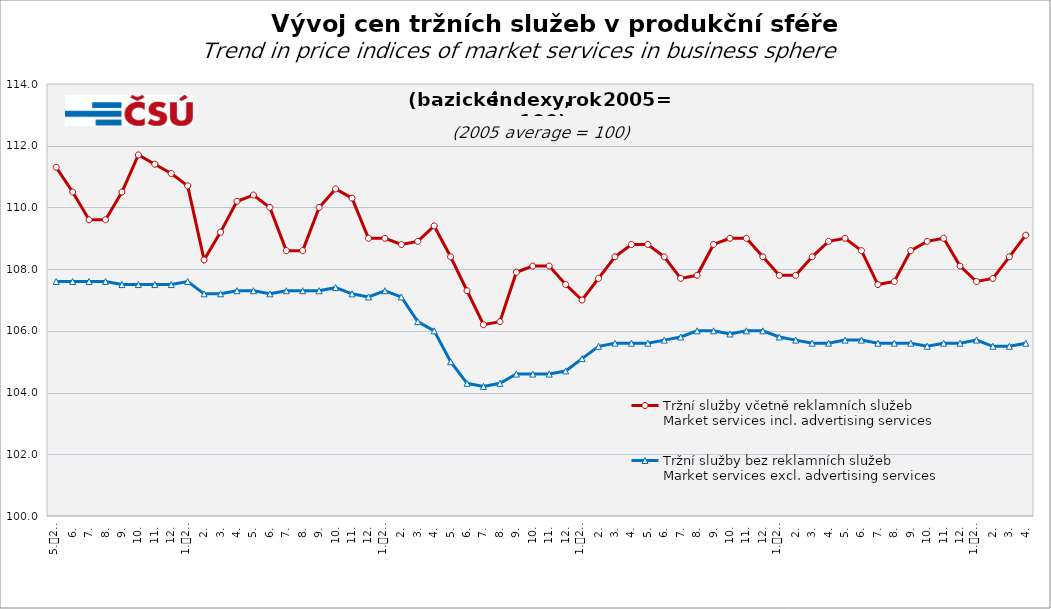
| Category | Tržní služby včetně reklamních služeb
Market services incl. advertising services | Tržní služby bez reklamních služeb
Market services excl. advertising services |
|---|---|---|
| 0 | 111.3 | 107.6 |
| 1 | 110.5 | 107.6 |
| 2 | 109.6 | 107.6 |
| 3 | 109.6 | 107.6 |
| 4 | 110.5 | 107.5 |
| 5 | 111.7 | 107.5 |
| 6 | 111.4 | 107.5 |
| 7 | 111.1 | 107.5 |
| 8 | 110.7 | 107.6 |
| 9 | 108.3 | 107.2 |
| 10 | 109.2 | 107.2 |
| 11 | 110.2 | 107.3 |
| 12 | 110.4 | 107.3 |
| 13 | 110 | 107.2 |
| 14 | 108.6 | 107.3 |
| 15 | 108.6 | 107.3 |
| 16 | 110 | 107.3 |
| 17 | 110.6 | 107.4 |
| 18 | 110.3 | 107.2 |
| 19 | 109 | 107.1 |
| 20 | 109 | 107.3 |
| 21 | 108.8 | 107.1 |
| 22 | 108.9 | 106.3 |
| 23 | 109.4 | 106 |
| 24 | 108.4 | 105 |
| 25 | 107.3 | 104.3 |
| 26 | 106.2 | 104.2 |
| 27 | 106.3 | 104.3 |
| 28 | 107.9 | 104.6 |
| 29 | 108.1 | 104.6 |
| 30 | 108.1 | 104.6 |
| 31 | 107.5 | 104.7 |
| 32 | 107 | 105.1 |
| 33 | 107.7 | 105.5 |
| 34 | 108.4 | 105.6 |
| 35 | 108.8 | 105.6 |
| 36 | 108.8 | 105.6 |
| 37 | 108.4 | 105.7 |
| 38 | 107.7 | 105.8 |
| 39 | 107.8 | 106 |
| 40 | 108.8 | 106 |
| 41 | 109 | 105.9 |
| 42 | 109 | 106 |
| 43 | 108.4 | 106 |
| 44 | 107.8 | 105.8 |
| 45 | 107.8 | 105.7 |
| 46 | 108.4 | 105.6 |
| 47 | 108.9 | 105.6 |
| 48 | 109 | 105.7 |
| 49 | 108.6 | 105.7 |
| 50 | 107.5 | 105.6 |
| 51 | 107.6 | 105.6 |
| 52 | 108.6 | 105.6 |
| 53 | 108.9 | 105.5 |
| 54 | 109 | 105.6 |
| 55 | 108.1 | 105.6 |
| 56 | 107.6 | 105.7 |
| 57 | 107.7 | 105.5 |
| 58 | 108.4 | 105.5 |
| 59 | 109.1 | 105.6 |